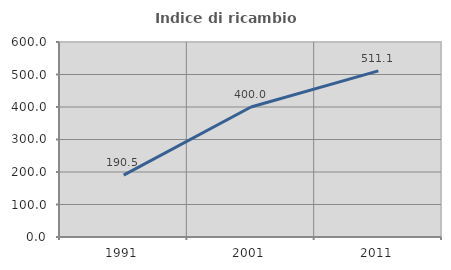
| Category | Indice di ricambio occupazionale  |
|---|---|
| 1991.0 | 190.476 |
| 2001.0 | 400 |
| 2011.0 | 511.111 |